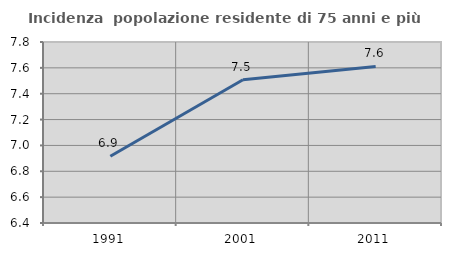
| Category | Incidenza  popolazione residente di 75 anni e più |
|---|---|
| 1991.0 | 6.916 |
| 2001.0 | 7.508 |
| 2011.0 | 7.611 |